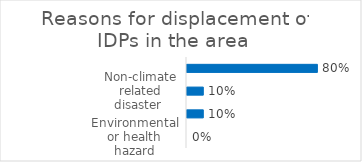
| Category | Series 0 |
|---|---|
| Environmental or health hazard | 0 |
| Climate related disaster | 0.1 |
| Non-climate related disaster  | 0.1 |
| Conflict/ violence or persecution | 0.8 |